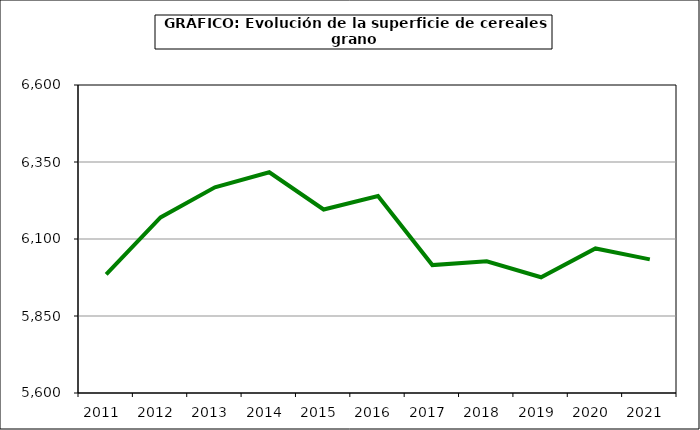
| Category | Superficie |
|---|---|
| 2011.0 | 5985.492 |
| 2012.0 | 6170.107 |
| 2013.0 | 6268.026 |
| 2014.0 | 6316.794 |
| 2015.0 | 6195.859 |
| 2016.0 | 6239.8 |
| 2017.0 | 6015.231 |
| 2018.0 | 6027.848 |
| 2019.0 | 5975.712 |
| 2020.0 | 6069.237 |
| 2021.0 | 6033.881 |